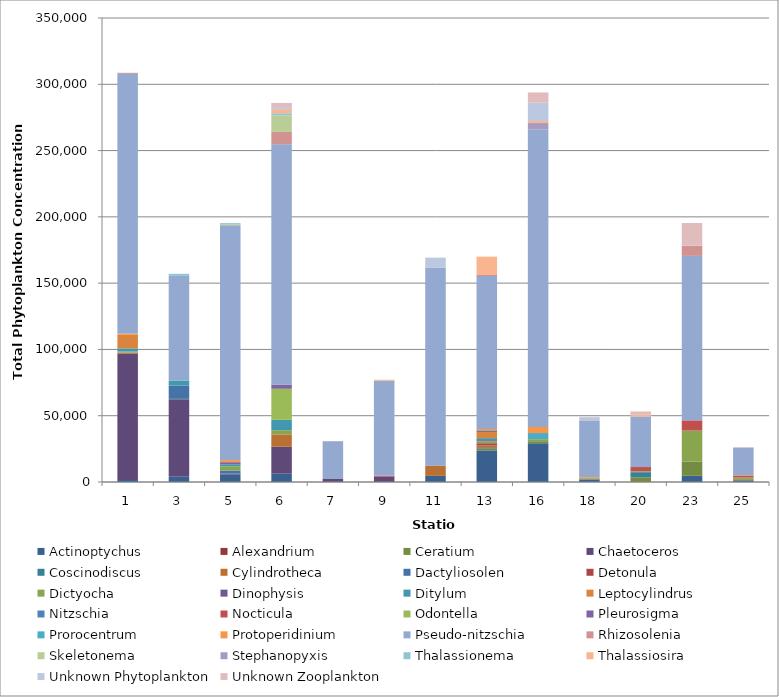
| Category | Actinoptychus | Alexandrium | Ceratium | Chaetoceros | Coscinodiscus | Cylindrotheca | Dactyliosolen | Detonula | Dictyocha | Dinophysis | Ditylum | Leptocylindrus | Nitzschia | Nocticula | Odontella | Pleurosigma | Prorocentrum | Protoperidinium | Pseudo-nitzschia | Rhizosolenia | Skeletonema | Stephanopyxis | Thalassionema | Thalassiosira | Unknown Phytoplankton | Unknown Zooplankton |
|---|---|---|---|---|---|---|---|---|---|---|---|---|---|---|---|---|---|---|---|---|---|---|---|---|---|---|
| 1.0 | 1574 | 0 | 0 | 95275 | 0 | 787 | 0 | 0 | 787 | 0 | 2362 | 10236 | 0 | 0 | 0 | 0 | 0 | 787 | 196062 | 787 | 0 | 0 | 0 | 0 | 0 | 0 |
| 3.0 | 3906 | 0 | 0 | 58593 | 781 | 0 | 9375 | 0 | 0 | 0 | 3906 | 0 | 0 | 0 | 0 | 0 | 0 | 0 | 78906 | 0 | 0 | 0 | 1562 | 0 | 0 | 0 |
| 5.0 | 5511 | 0 | 0 | 787 | 0 | 0 | 2362 | 0 | 3149 | 0 | 1574 | 0 | 0 | 0 | 0 | 1574 | 0 | 1574 | 177165 | 0 | 787 | 0 | 787 | 0 | 0 | 0 |
| 6.0 | 6250 | 0 | 0 | 20312 | 0 | 9375 | 0 | 0 | 3125 | 0 | 7812 | 0 | 0 | 0 | 23437 | 3125 | 0 | 0 | 181250 | 9375 | 12500 | 0 | 1562 | 3125 | 1562 | 3125 |
| 7.0 | 0 | 0 | 0 | 2564 | 0 | 0 | 0 | 0 | 0 | 0 | 256 | 0 | 0 | 0 | 0 | 0 | 0 | 0 | 27948 | 0 | 0 | 0 | 0 | 0 | 0 | 0 |
| 9.0 | 0 | 0 | 0 | 3937 | 0 | 0 | 0 | 0 | 0 | 0 | 0 | 0 | 0 | 787 | 0 | 0 | 0 | 0 | 71653 | 0 | 0 | 0 | 0 | 787 | 0 | 0 |
| 11.0 | 4615 | 0 | 0 | 0 | 0 | 7692 | 0 | 0 | 0 | 0 | 0 | 0 | 0 | 0 | 0 | 0 | 0 | 0 | 149230 | 0 | 0 | 0 | 0 | 0 | 7692 | 0 |
| 13.0 | 23846 | 0 | 1538 | 769 | 0 | 1538 | 0 | 1538 | 1538 | 769 | 1538 | 4615 | 769 | 0 | 0 | 0 | 0 | 1538 | 115384 | 769 | 0 | 0 | 0 | 13846 | 0 | 0 |
| 16.0 | 29230 | 0 | 1538 | 0 | 0 | 0 | 0 | 0 | 1538 | 0 | 0 | 0 | 0 | 0 | 0 | 0 | 4615 | 4615 | 224615 | 0 | 0 | 4615 | 0 | 1538 | 13846 | 7692 |
| 18.0 | 1904 | 0 | 317 | 0 | 317 | 317 | 0 | 0 | 317 | 0 | 0 | 0 | 0 | 0 | 0 | 0 | 0 | 634 | 42222 | 0 | 0 | 0 | 0 | 0 | 2857 | 317 |
| 20.0 | 0 | 0 | 3548 | 0 | 3870 | 0 | 0 | 0 | 645 | 0 | 0 | 0 | 0 | 3225 | 0 | 0 | 0 | 0 | 38064 | 0 | 0 | 0 | 0 | 1290 | 0 | 2580 |
| 23.0 | 4651 | 0 | 10852 | 0 | 0 | 0 | 0 | 0 | 23255 | 0 | 0 | 0 | 0 | 7751 | 0 | 0 | 0 | 0 | 124031 | 7751 | 0 | 0 | 0 | 0 | 0 | 17054 |
| 25.0 | 1291 | 0 | 775 | 0 | 0 | 258 | 0 | 0 | 1033 | 0 | 0 | 0 | 0 | 1550 | 0 | 0 | 0 | 258 | 20671 | 258 | 0 | 0 | 0 | 0 | 0 | 0 |